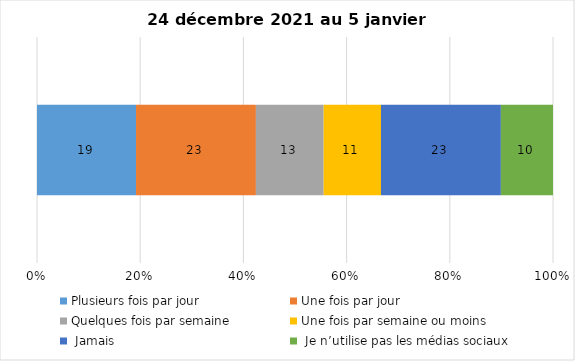
| Category | Plusieurs fois par jour | Une fois par jour | Quelques fois par semaine   | Une fois par semaine ou moins   |  Jamais   |  Je n’utilise pas les médias sociaux |
|---|---|---|---|---|---|---|
| 0 | 19 | 23 | 13 | 11 | 23 | 10 |